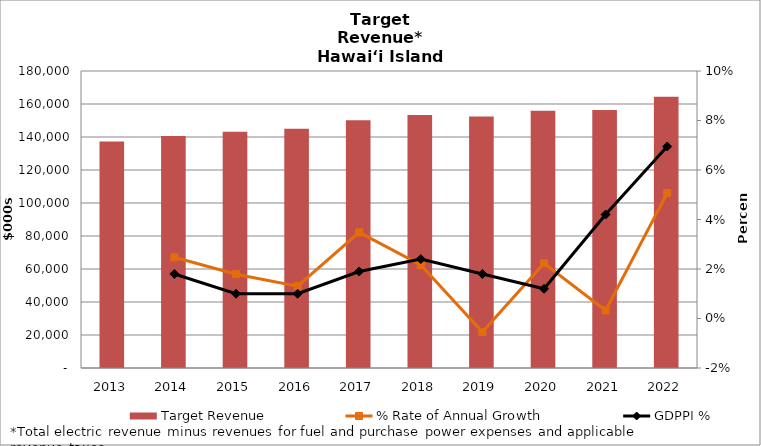
| Category | Target Revenue |
|---|---|
| 2013.0 | 137247.762 |
| 2014.0 | 140642.437 |
| 2015.0 | 143160.741 |
| 2016.0 | 145034.145 |
| 2017.0 | 150080.699 |
| 2018.0 | 153324.004 |
| 2019.0 | 152489.878 |
| 2020.0 | 155897.762 |
| 2021.0 | 156403.198 |
| 2022.0 | 164327.619 |